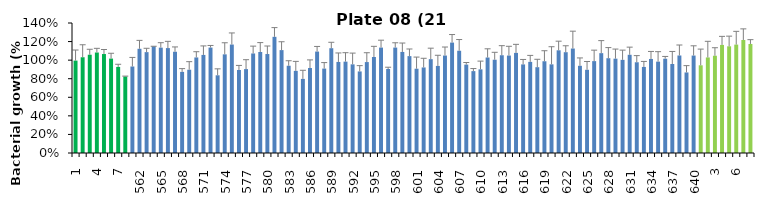
| Category | 21 h % |
|---|---|
| 1.0 | 0.995 |
| 2.0 | 1.031 |
| 3.0 | 1.058 |
| 4.0 | 1.082 |
| 5.0 | 1.066 |
| 6.0 | 1.017 |
| 7.0 | 0.927 |
| 8.0 | 0.824 |
| 561.0 | 0.932 |
| 562.0 | 1.122 |
| 563.0 | 1.086 |
| 564.0 | 1.148 |
| 565.0 | 1.135 |
| 566.0 | 1.13 |
| 567.0 | 1.09 |
| 568.0 | 0.874 |
| 569.0 | 0.897 |
| 570.0 | 1.029 |
| 571.0 | 1.056 |
| 572.0 | 1.135 |
| 573.0 | 0.837 |
| 574.0 | 1.062 |
| 575.0 | 1.168 |
| 576.0 | 0.894 |
| 577.0 | 0.904 |
| 578.0 | 1.072 |
| 579.0 | 1.088 |
| 580.0 | 1.066 |
| 581.0 | 1.251 |
| 582.0 | 1.108 |
| 583.0 | 0.94 |
| 584.0 | 0.885 |
| 585.0 | 0.798 |
| 586.0 | 0.915 |
| 587.0 | 1.092 |
| 588.0 | 0.909 |
| 589.0 | 1.129 |
| 590.0 | 0.981 |
| 591.0 | 0.984 |
| 592.0 | 0.955 |
| 593.0 | 0.878 |
| 594.0 | 0.979 |
| 595.0 | 1.034 |
| 596.0 | 1.135 |
| 597.0 | 0.904 |
| 598.0 | 1.135 |
| 599.0 | 1.088 |
| 600.0 | 1.043 |
| 601.0 | 0.908 |
| 602.0 | 0.921 |
| 603.0 | 1.011 |
| 604.0 | 0.938 |
| 605.0 | 1.049 |
| 606.0 | 1.189 |
| 607.0 | 1.101 |
| 608.0 | 0.952 |
| 609.0 | 0.882 |
| 610.0 | 0.901 |
| 611.0 | 1.028 |
| 612.0 | 1.005 |
| 613.0 | 1.053 |
| 614.0 | 1.049 |
| 615.0 | 1.078 |
| 616.0 | 0.954 |
| 617.0 | 0.981 |
| 618.0 | 0.924 |
| 619.0 | 0.988 |
| 620.0 | 0.955 |
| 621.0 | 1.106 |
| 622.0 | 1.086 |
| 623.0 | 1.125 |
| 624.0 | 0.939 |
| 625.0 | 0.896 |
| 626.0 | 0.99 |
| 627.0 | 1.075 |
| 628.0 | 1.021 |
| 629.0 | 1.016 |
| 630.0 | 1.003 |
| 631.0 | 1.058 |
| 632.0 | 0.977 |
| 633.0 | 0.927 |
| 634.0 | 1.013 |
| 635.0 | 0.984 |
| 636.0 | 1.015 |
| 637.0 | 0.958 |
| 638.0 | 1.05 |
| 639.0 | 0.868 |
| 640.0 | 1.049 |
| 1.0 | 0.945 |
| 2.0 | 1.029 |
| 3.0 | 1.047 |
| 4.0 | 1.164 |
| 5.0 | 1.149 |
| 6.0 | 1.167 |
| 7.0 | 1.217 |
| 8.0 | 1.174 |